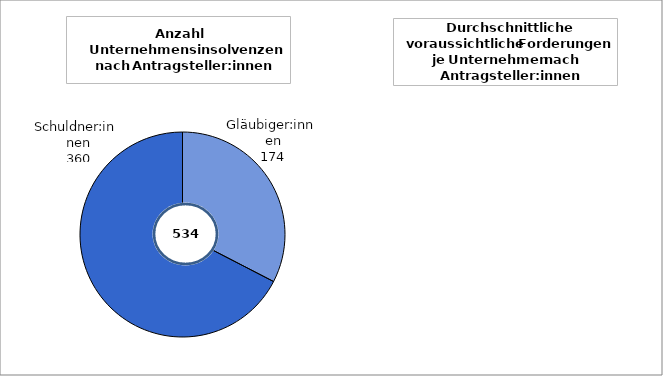
| Category | Series 0 |
|---|---|
| Gläubiger:innen | 174 |
| Schuldner:innen | 360 |